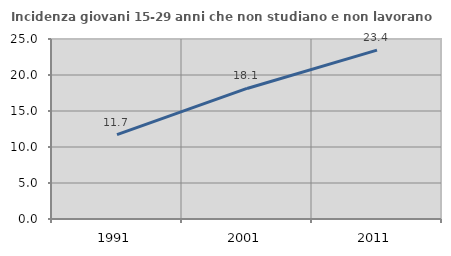
| Category | Incidenza giovani 15-29 anni che non studiano e non lavorano  |
|---|---|
| 1991.0 | 11.709 |
| 2001.0 | 18.132 |
| 2011.0 | 23.448 |